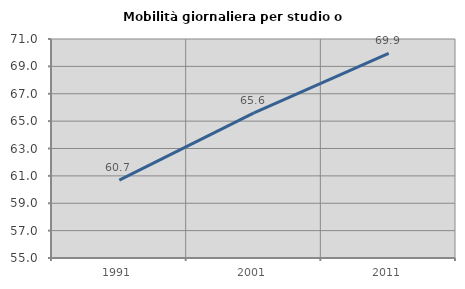
| Category | Mobilità giornaliera per studio o lavoro |
|---|---|
| 1991.0 | 60.684 |
| 2001.0 | 65.599 |
| 2011.0 | 69.942 |